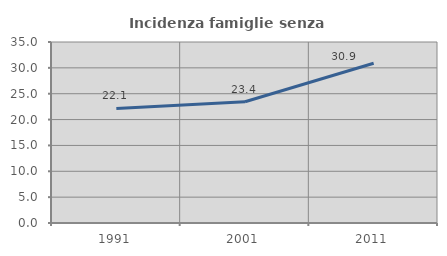
| Category | Incidenza famiglie senza nuclei |
|---|---|
| 1991.0 | 22.145 |
| 2001.0 | 23.439 |
| 2011.0 | 30.892 |